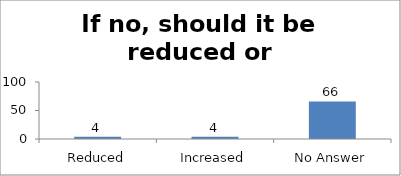
| Category | If no, should it be reduced or increased: |
|---|---|
| Reduced | 4 |
| Increased | 4 |
| No Answer | 66 |